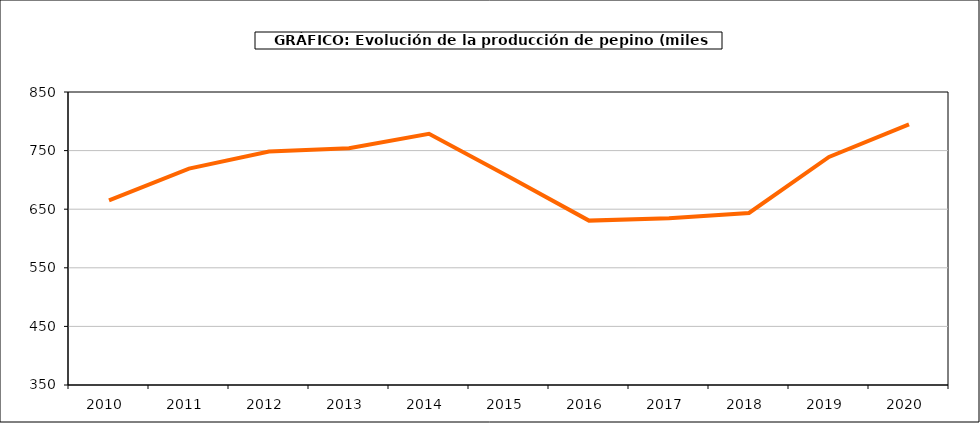
| Category | producción |
|---|---|
| 2010.0 | 664.975 |
| 2011.0 | 719.219 |
| 2012.0 | 748.5 |
| 2013.0 | 753.941 |
| 2014.0 | 778.571 |
| 2015.0 | 705.223 |
| 2016.0 | 630.525 |
| 2017.0 | 634.43 |
| 2018.0 | 643.621 |
| 2019.0 | 739.165 |
| 2020.0 | 794.867 |